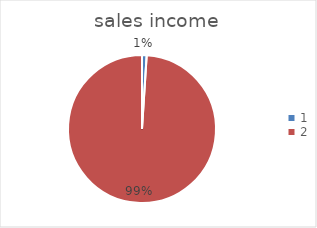
| Category | Series 0 | Series 1 |
|---|---|---|
| 0 | 5 | 100 |
| 1 | 490 | 5200 |